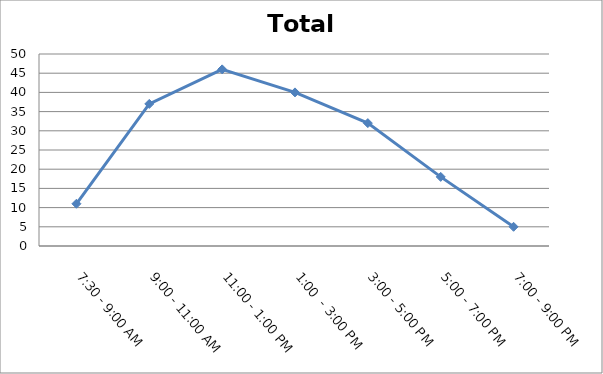
| Category | Total |
|---|---|
| 7:30 - 9:00 AM | 11 |
| 9:00 - 11:00 AM | 37 |
| 11:00 - 1:00 PM | 46 |
| 1:00  - 3:00 PM | 40 |
| 3:00 - 5:00 PM | 32 |
| 5:00 - 7:00 PM | 18 |
| 7:00 - 9:00 PM | 5 |